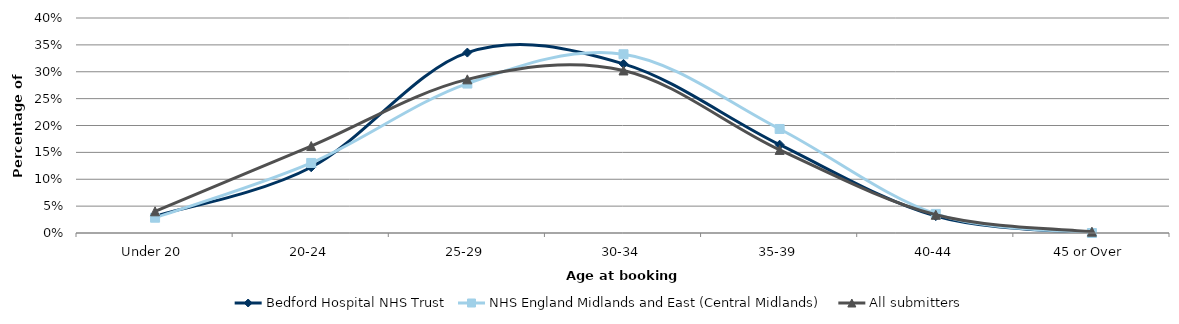
| Category | Bedford Hospital NHS Trust | NHS England Midlands and East (Central Midlands) | All submitters |
|---|---|---|---|
| Under 20 | 0.031 | 0.028 | 0.04 |
| 20-24 | 0.122 | 0.13 | 0.162 |
| 25-29 | 0.336 | 0.278 | 0.286 |
| 30-34 | 0.315 | 0.333 | 0.302 |
| 35-39 | 0.164 | 0.194 | 0.155 |
| 40-44 | 0.031 | 0.036 | 0.034 |
| 45 or Over | 0 | 0 | 0.002 |